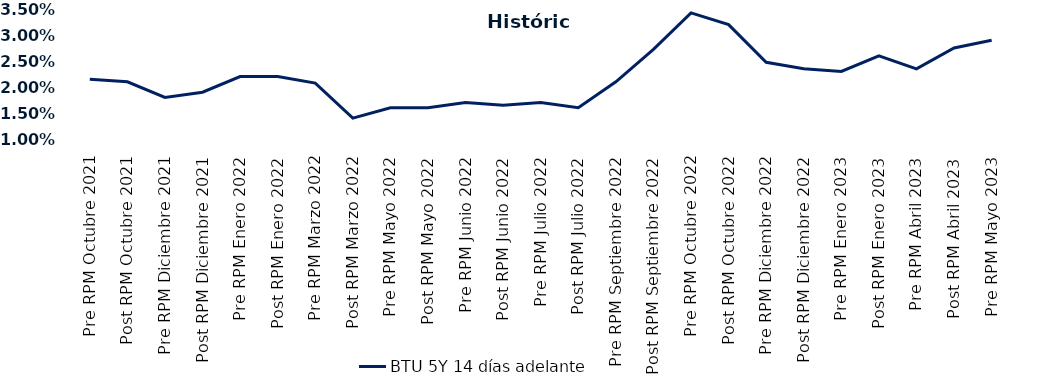
| Category | BTU 5Y 14 días adelante |
|---|---|
| Pre RPM Octubre 2021 | 0.022 |
| Post RPM Octubre 2021 | 0.021 |
| Pre RPM Diciembre 2021 | 0.018 |
| Post RPM Diciembre 2021 | 0.019 |
| Pre RPM Enero 2022 | 0.022 |
| Post RPM Enero 2022 | 0.022 |
| Pre RPM Marzo 2022 | 0.021 |
| Post RPM Marzo 2022 | 0.014 |
| Pre RPM Mayo 2022 | 0.016 |
| Post RPM Mayo 2022 | 0.016 |
| Pre RPM Junio 2022 | 0.017 |
| Post RPM Junio 2022 | 0.016 |
| Pre RPM Julio 2022 | 0.017 |
| Post RPM Julio 2022 | 0.016 |
| Pre RPM Septiembre 2022 | 0.021 |
| Post RPM Septiembre 2022 | 0.027 |
| Pre RPM Octubre 2022 | 0.034 |
| Post RPM Octubre 2022 | 0.032 |
| Pre RPM Diciembre 2022 | 0.025 |
| Post RPM Diciembre 2022 | 0.024 |
| Pre RPM Enero 2023 | 0.023 |
| Post RPM Enero 2023 | 0.026 |
| Pre RPM Abril 2023 | 0.024 |
| Post RPM Abril 2023 | 0.028 |
| Pre RPM Mayo 2023 | 0.029 |